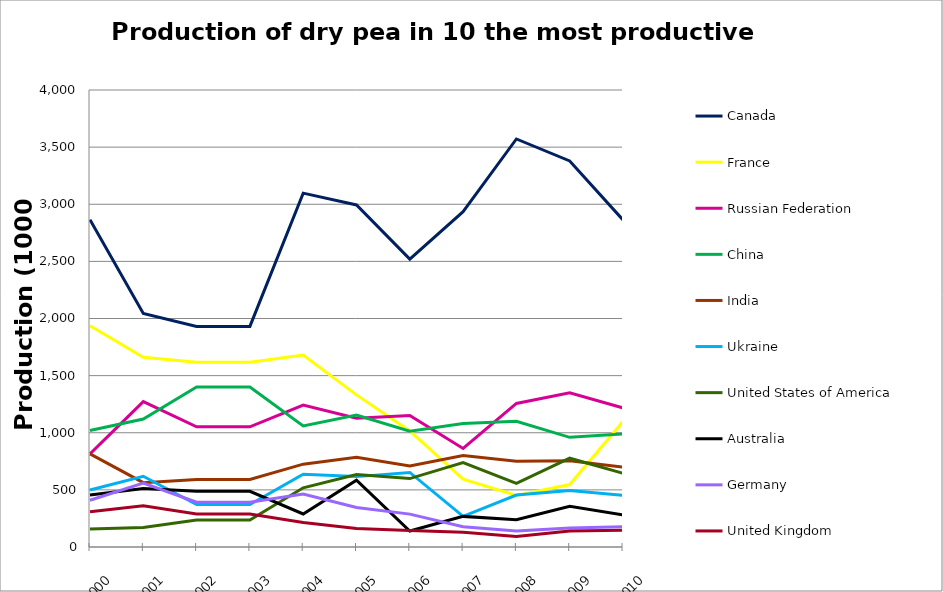
| Category | Canada | France | Russian Federation | China | India | Ukraine | United States of America | Australia | Germany | United Kingdom |
|---|---|---|---|---|---|---|---|---|---|---|
| 2000.0 | 2864300 | 1936500 | 815230 | 1020000 | 814800 | 499400 | 157578 | 456000 | 408902 | 309000 |
| 2001.0 | 2044800 | 1660000 | 1272350 | 1120000 | 563200 | 619000 | 170687 | 512000 | 559633 | 361000 |
| 2002.0 | 1930900 | 1616660 | 1052100 | 1400000 | 591500 | 371200 | 235959 | 487428 | 391739 | 288000 |
| 2003.0 | 1930900 | 1616660 | 1052100 | 1400000 | 591500 | 371200 | 235959 | 487428 | 391739 | 288000 |
| 2004.0 | 3097200 | 1680780 | 1242500 | 1060000 | 725200 | 636300 | 517957 | 289362 | 464212 | 214866 |
| 2005.0 | 2993600 | 1331290 | 1126790 | 1155000 | 785600 | 616000 | 635165 | 585000 | 346300 | 161000 |
| 2006.0 | 2519900 | 1016190 | 1150640 | 1013000 | 709900 | 652700 | 598880 | 140000 | 287700 | 145000 |
| 2007.0 | 2934800 | 594095 | 862644 | 1080000 | 800000 | 268100 | 738766 | 268000 | 177487 | 130000 |
| 2008.0 | 3571300 | 451416 | 1256830 | 1100000 | 749981 | 454900 | 556560 | 238141 | 140556 | 91000 |
| 2009.0 | 3379400 | 546846 | 1348890 | 960000 | 754459 | 493600 | 777320 | 356000 | 165907 | 141000 |
| 2010.0 | 2862400 | 1098120 | 1217840 | 990500 | 700000 | 452400 | 645050 | 280000 | 176700 | 147000 |